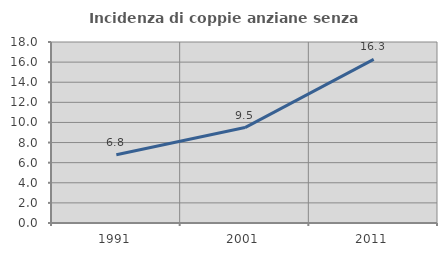
| Category | Incidenza di coppie anziane senza figli  |
|---|---|
| 1991.0 | 6.792 |
| 2001.0 | 9.489 |
| 2011.0 | 16.279 |